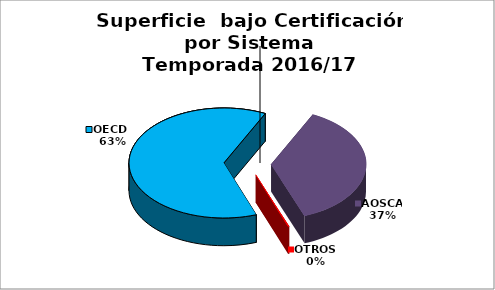
| Category | Series 0 |
|---|---|
| OECD  | 7527.677 |
| AOSCA | 4447.646 |
| OTROS | 21 |